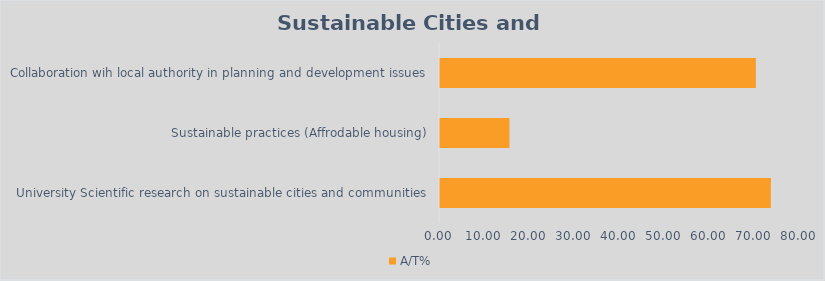
| Category | A/T% |
|---|---|
| University Scientific research on sustainable cities and communities | 73.333 |
| Sustainable practices (Affrodable housing) | 15.385 |
| Collaboration wih local authority in planning and development issues | 70 |